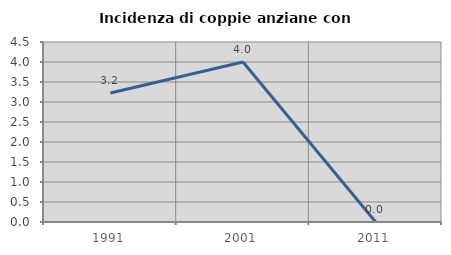
| Category | Incidenza di coppie anziane con figli |
|---|---|
| 1991.0 | 3.226 |
| 2001.0 | 4 |
| 2011.0 | 0 |